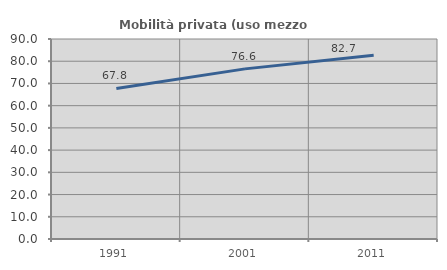
| Category | Mobilità privata (uso mezzo privato) |
|---|---|
| 1991.0 | 67.754 |
| 2001.0 | 76.553 |
| 2011.0 | 82.662 |